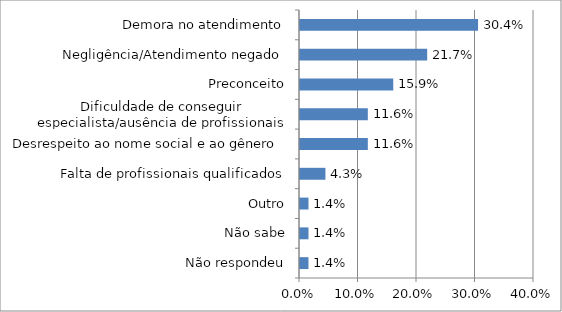
| Category | Series 0 |
|---|---|
| Não respondeu | 0.014 |
| Não sabe | 0.014 |
| Outro | 0.014 |
| Falta de profissionais qualificados | 0.043 |
| Desrespeito ao nome social e ao gênero  | 0.116 |
| Dificuldade de conseguir especialista/ausência de profissionais | 0.116 |
| Preconceito | 0.159 |
| Negligência/Atendimento negado | 0.217 |
| Demora no atendimento | 0.304 |